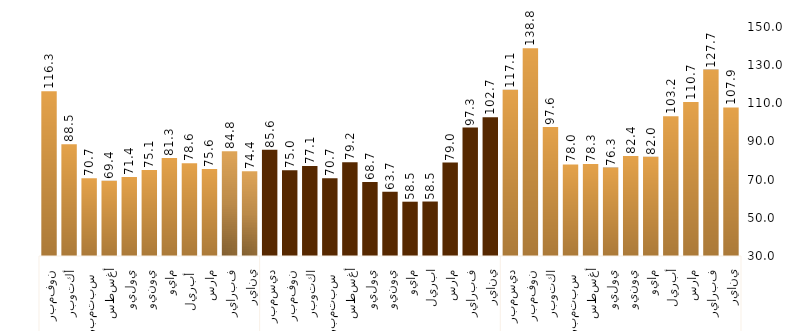
| Category | Series 0 |
|---|---|
| 0 | 107.861 |
| 1 | 127.674 |
| 2 | 110.742 |
| 3 | 103.239 |
| 4 | 82.016 |
| 5 | 82.421 |
| 6 | 76.314 |
| 7 | 78.265 |
| 8 | 77.961 |
| 9 | 97.566 |
| 10 | 138.85 |
| 11 | 117.091 |
| 12 | 102.678 |
| 13 | 97.332 |
| 14 | 78.955 |
| 15 | 58.549 |
| 16 | 58.455 |
| 17 | 63.691 |
| 18 | 68.721 |
| 19 | 79.161 |
| 20 | 70.692 |
| 21 | 77.111 |
| 22 | 74.955 |
| 23 | 85.627 |
| 24 | 74.378 |
| 25 | 84.831 |
| 26 | 75.573 |
| 27 | 78.621 |
| 28 | 81.312 |
| 29 | 75.092 |
| 30 | 71.411 |
| 31 | 69.374 |
| 32 | 70.7 |
| 33 | 88.5 |
| 34 | 116.296 |